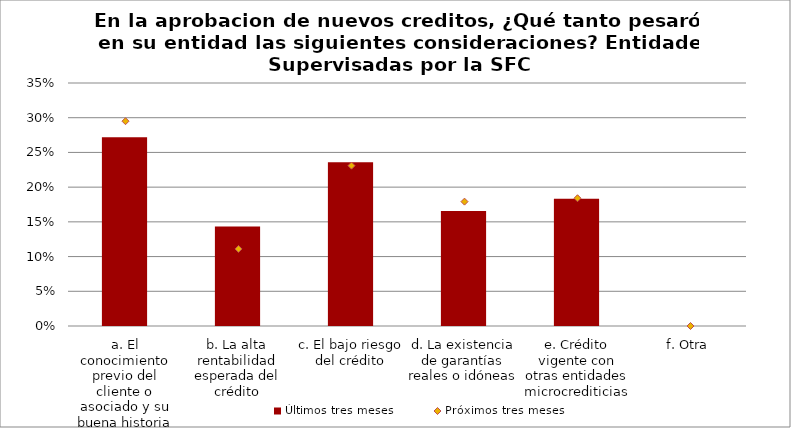
| Category | Últimos tres meses |
|---|---|
| a. El conocimiento previo del cliente o asociado y su buena historia de crédito | 0.272 |
| b. La alta rentabilidad esperada del crédito | 0.143 |
| c. El bajo riesgo del crédito | 0.236 |
| d. La existencia de garantías reales o idóneas | 0.166 |
| e. Crédito vigente con otras entidades microcrediticias | 0.183 |
| f. Otra | 0 |